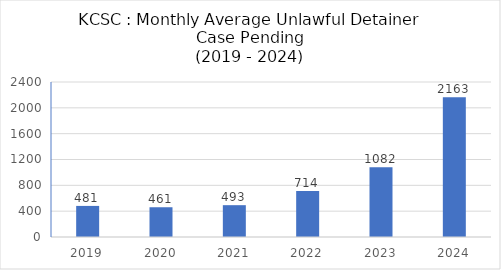
| Category | Series 0 |
|---|---|
| 2019.0 | 481.333 |
| 2020.0 | 460.667 |
| 2021.0 | 492.75 |
| 2022.0 | 714.167 |
| 2023.0 | 1081.833 |
| 2024.0 | 2163.4 |